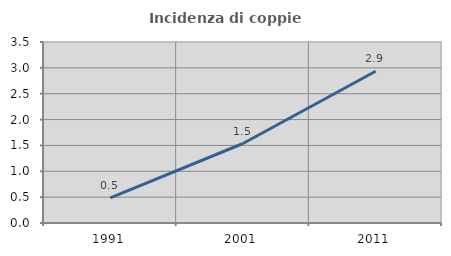
| Category | Incidenza di coppie miste |
|---|---|
| 1991.0 | 0.486 |
| 2001.0 | 1.537 |
| 2011.0 | 2.935 |